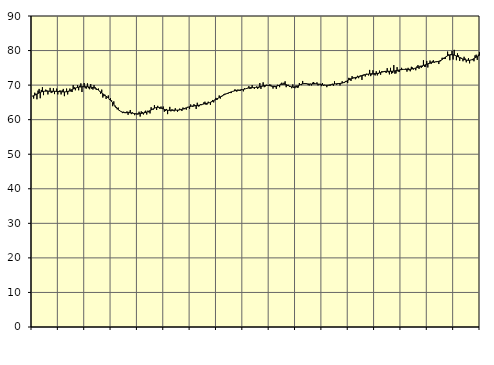
| Category | Piggar | Series 1 |
|---|---|---|
| nan | 66.9 | 66.79 |
| 87.0 | 66.1 | 66.92 |
| 87.0 | 67.8 | 67.08 |
| 87.0 | 67.5 | 67.26 |
| 87.0 | 65.9 | 67.42 |
| 87.0 | 68.4 | 67.59 |
| 87.0 | 68.9 | 67.75 |
| 87.0 | 66.2 | 67.9 |
| 87.0 | 68.6 | 68.03 |
| 87.0 | 69.4 | 68.12 |
| 87.0 | 67.1 | 68.19 |
| 87.0 | 68.2 | 68.23 |
| nan | 68.7 | 68.25 |
| 88.0 | 68.5 | 68.26 |
| 88.0 | 67.3 | 68.25 |
| 88.0 | 68.3 | 68.24 |
| 88.0 | 69.2 | 68.24 |
| 88.0 | 67.7 | 68.23 |
| 88.0 | 67.9 | 68.22 |
| 88.0 | 69.1 | 68.22 |
| 88.0 | 67.4 | 68.21 |
| 88.0 | 68.3 | 68.2 |
| 88.0 | 69 | 68.18 |
| 88.0 | 67.3 | 68.16 |
| nan | 68.3 | 68.13 |
| 89.0 | 68.5 | 68.11 |
| 89.0 | 67.3 | 68.08 |
| 89.0 | 68.5 | 68.05 |
| 89.0 | 68.9 | 68.03 |
| 89.0 | 66.8 | 68.03 |
| 89.0 | 68.1 | 68.05 |
| 89.0 | 69 | 68.1 |
| 89.0 | 67.3 | 68.17 |
| 89.0 | 68.1 | 68.28 |
| 89.0 | 69 | 68.41 |
| 89.0 | 68.1 | 68.56 |
| nan | 68 | 68.71 |
| 90.0 | 70 | 68.87 |
| 90.0 | 69.4 | 69.01 |
| 90.0 | 68.5 | 69.14 |
| 90.0 | 69.2 | 69.24 |
| 90.0 | 70 | 69.33 |
| 90.0 | 68.5 | 69.4 |
| 90.0 | 69.8 | 69.45 |
| 90.0 | 70.5 | 69.48 |
| 90.0 | 68 | 69.51 |
| 90.0 | 69.7 | 69.53 |
| 90.0 | 70.6 | 69.54 |
| nan | 69.1 | 69.54 |
| 91.0 | 69 | 69.54 |
| 91.0 | 70.5 | 69.52 |
| 91.0 | 69.1 | 69.49 |
| 91.0 | 68.8 | 69.47 |
| 91.0 | 70.3 | 69.42 |
| 91.0 | 68.9 | 69.37 |
| 91.0 | 68.7 | 69.3 |
| 91.0 | 70 | 69.21 |
| 91.0 | 69.4 | 69.1 |
| 91.0 | 68.6 | 68.95 |
| 91.0 | 68.7 | 68.77 |
| nan | 69 | 68.54 |
| 92.0 | 68.2 | 68.29 |
| 92.0 | 67.5 | 68.03 |
| 92.0 | 68.7 | 67.76 |
| 92.0 | 66.4 | 67.5 |
| 92.0 | 66.8 | 67.25 |
| 92.0 | 67.2 | 67.01 |
| 92.0 | 66 | 66.77 |
| 92.0 | 66.6 | 66.52 |
| 92.0 | 67 | 66.25 |
| 92.0 | 65.7 | 65.95 |
| 92.0 | 66.2 | 65.62 |
| nan | 65.6 | 65.27 |
| 93.0 | 63.9 | 64.88 |
| 93.0 | 65.3 | 64.48 |
| 93.0 | 63.8 | 64.07 |
| 93.0 | 63.4 | 63.67 |
| 93.0 | 63 | 63.3 |
| 93.0 | 63.5 | 62.97 |
| 93.0 | 62.5 | 62.69 |
| 93.0 | 62.5 | 62.46 |
| 93.0 | 62.2 | 62.29 |
| 93.0 | 61.9 | 62.16 |
| 93.0 | 62.3 | 62.09 |
| nan | 61.9 | 62.05 |
| 94.0 | 61.9 | 62.04 |
| 94.0 | 62.4 | 62.04 |
| 94.0 | 61.4 | 62.04 |
| 94.0 | 62.3 | 62.03 |
| 94.0 | 62.8 | 62 |
| 94.0 | 61.6 | 61.96 |
| 94.0 | 62.1 | 61.89 |
| 94.0 | 61.9 | 61.82 |
| 94.0 | 61.3 | 61.76 |
| 94.0 | 61.8 | 61.71 |
| 94.0 | 61.5 | 61.69 |
| nan | 61.5 | 61.69 |
| 95.0 | 62.3 | 61.71 |
| 95.0 | 60.9 | 61.76 |
| 95.0 | 62.4 | 61.81 |
| 95.0 | 62.2 | 61.87 |
| 95.0 | 61.5 | 61.93 |
| 95.0 | 62.3 | 62 |
| 95.0 | 62.6 | 62.08 |
| 95.0 | 61.5 | 62.17 |
| 95.0 | 62.6 | 62.3 |
| 95.0 | 62.1 | 62.45 |
| 95.0 | 61.8 | 62.62 |
| nan | 63.6 | 62.8 |
| 96.0 | 63.1 | 62.98 |
| 96.0 | 62.9 | 63.16 |
| 96.0 | 64.2 | 63.32 |
| 96.0 | 63.5 | 63.45 |
| 96.0 | 62.8 | 63.54 |
| 96.0 | 64 | 63.57 |
| 96.0 | 63.5 | 63.54 |
| 96.0 | 63.1 | 63.46 |
| 96.0 | 63.8 | 63.36 |
| 96.0 | 63.4 | 63.23 |
| 96.0 | 63.8 | 63.1 |
| nan | 62.3 | 62.98 |
| 97.0 | 62.5 | 62.87 |
| 97.0 | 63.1 | 62.79 |
| 97.0 | 61.6 | 62.74 |
| 97.0 | 62.8 | 62.71 |
| 97.0 | 63.7 | 62.7 |
| 97.0 | 62.4 | 62.71 |
| 97.0 | 63 | 62.72 |
| 97.0 | 62.6 | 62.74 |
| 97.0 | 62.4 | 62.75 |
| 97.0 | 63.3 | 62.76 |
| 97.0 | 62.7 | 62.76 |
| nan | 62.3 | 62.77 |
| 98.0 | 62.7 | 62.8 |
| 98.0 | 63.2 | 62.84 |
| 98.0 | 63 | 62.91 |
| 98.0 | 62.5 | 62.99 |
| 98.0 | 63.5 | 63.09 |
| 98.0 | 63 | 63.19 |
| 98.0 | 63.4 | 63.3 |
| 98.0 | 62.9 | 63.42 |
| 98.0 | 63.7 | 63.54 |
| 98.0 | 63.6 | 63.66 |
| 98.0 | 63.1 | 63.76 |
| nan | 64.4 | 63.84 |
| 99.0 | 64 | 63.91 |
| 99.0 | 63.7 | 63.96 |
| 99.0 | 64.5 | 63.99 |
| 99.0 | 64.2 | 64.02 |
| 99.0 | 63.1 | 64.06 |
| 99.0 | 64.9 | 64.1 |
| 99.0 | 63.8 | 64.16 |
| 99.0 | 63.9 | 64.22 |
| 99.0 | 64.5 | 64.3 |
| 99.0 | 64.2 | 64.38 |
| 99.0 | 64.4 | 64.47 |
| nan | 65 | 64.55 |
| 0.0 | 65.2 | 64.62 |
| 0.0 | 64.3 | 64.68 |
| 0.0 | 64.4 | 64.75 |
| 0.0 | 65.2 | 64.82 |
| 0.0 | 64.9 | 64.91 |
| 0.0 | 64.3 | 65.02 |
| 0.0 | 65.3 | 65.15 |
| 0.0 | 65.7 | 65.31 |
| 0.0 | 65 | 65.48 |
| 0.0 | 65.8 | 65.66 |
| 0.0 | 66.3 | 65.85 |
| nan | 65.7 | 66.04 |
| 1.0 | 66.2 | 66.22 |
| 1.0 | 67 | 66.41 |
| 1.0 | 66.1 | 66.6 |
| 1.0 | 66.6 | 66.78 |
| 1.0 | 66.8 | 66.95 |
| 1.0 | 67.3 | 67.11 |
| 1.0 | 67.5 | 67.26 |
| 1.0 | 67.5 | 67.41 |
| 1.0 | 67.6 | 67.55 |
| 1.0 | 67.5 | 67.68 |
| 1.0 | 67.9 | 67.81 |
| nan | 67.7 | 67.93 |
| 2.0 | 67.7 | 68.05 |
| 2.0 | 68.2 | 68.16 |
| 2.0 | 68.3 | 68.25 |
| 2.0 | 68.7 | 68.34 |
| 2.0 | 68.7 | 68.41 |
| 2.0 | 68.1 | 68.46 |
| 2.0 | 68.7 | 68.5 |
| 2.0 | 68.4 | 68.54 |
| 2.0 | 68.3 | 68.57 |
| 2.0 | 68.8 | 68.61 |
| 2.0 | 68.7 | 68.67 |
| nan | 68.2 | 68.74 |
| 3.0 | 69.1 | 68.83 |
| 3.0 | 68.9 | 68.93 |
| 3.0 | 68.9 | 69.03 |
| 3.0 | 69.2 | 69.11 |
| 3.0 | 69.7 | 69.18 |
| 3.0 | 68.9 | 69.23 |
| 3.0 | 69 | 69.26 |
| 3.0 | 70 | 69.28 |
| 3.0 | 69.3 | 69.29 |
| 3.0 | 68.9 | 69.3 |
| 3.0 | 69.3 | 69.32 |
| nan | 69.6 | 69.35 |
| 4.0 | 68.9 | 69.4 |
| 4.0 | 69.2 | 69.46 |
| 4.0 | 70.6 | 69.53 |
| 4.0 | 68.9 | 69.61 |
| 4.0 | 69.6 | 69.7 |
| 4.0 | 70.8 | 69.78 |
| 4.0 | 69.4 | 69.85 |
| 4.0 | 69.6 | 69.9 |
| 4.0 | 70.1 | 69.92 |
| 4.0 | 70 | 69.92 |
| 4.0 | 69.8 | 69.88 |
| nan | 70.2 | 69.83 |
| 5.0 | 70.1 | 69.76 |
| 5.0 | 69.6 | 69.7 |
| 5.0 | 69 | 69.64 |
| 5.0 | 69.8 | 69.61 |
| 5.0 | 69.4 | 69.62 |
| 5.0 | 68.9 | 69.67 |
| 5.0 | 70.1 | 69.77 |
| 5.0 | 70 | 69.89 |
| 5.0 | 69.4 | 70.03 |
| 5.0 | 70.4 | 70.16 |
| 5.0 | 70.7 | 70.25 |
| nan | 70.1 | 70.3 |
| 6.0 | 70.7 | 70.29 |
| 6.0 | 71.1 | 70.23 |
| 6.0 | 69.4 | 70.13 |
| 6.0 | 69.8 | 70.01 |
| 6.0 | 70.1 | 69.86 |
| 6.0 | 69.5 | 69.72 |
| 6.0 | 69.5 | 69.59 |
| 6.0 | 69.1 | 69.49 |
| 6.0 | 70.2 | 69.44 |
| 6.0 | 69.2 | 69.44 |
| 6.0 | 69.1 | 69.48 |
| nan | 69.9 | 69.57 |
| 7.0 | 69.2 | 69.7 |
| 7.0 | 69.3 | 69.84 |
| 7.0 | 70.6 | 70 |
| 7.0 | 70.2 | 70.15 |
| 7.0 | 70 | 70.27 |
| 7.0 | 71.2 | 70.36 |
| 7.0 | 70.3 | 70.42 |
| 7.0 | 70.6 | 70.43 |
| 7.0 | 70.6 | 70.41 |
| 7.0 | 70.4 | 70.38 |
| 7.0 | 70 | 70.34 |
| nan | 69.9 | 70.31 |
| 8.0 | 70.4 | 70.29 |
| 8.0 | 69.9 | 70.29 |
| 8.0 | 70.7 | 70.31 |
| 8.0 | 70.9 | 70.32 |
| 8.0 | 70.6 | 70.34 |
| 8.0 | 70.4 | 70.35 |
| 8.0 | 70.8 | 70.33 |
| 8.0 | 69.9 | 70.3 |
| 8.0 | 70.2 | 70.26 |
| 8.0 | 70.4 | 70.2 |
| 8.0 | 69.7 | 70.14 |
| nan | 70.6 | 70.08 |
| 9.0 | 69.8 | 70.03 |
| 9.0 | 70.1 | 69.99 |
| 9.0 | 70 | 69.97 |
| 9.0 | 69.4 | 69.97 |
| 9.0 | 69.9 | 69.99 |
| 9.0 | 69.9 | 70.03 |
| 9.0 | 69.8 | 70.08 |
| 9.0 | 70.2 | 70.14 |
| 9.0 | 70.4 | 70.2 |
| 9.0 | 69.8 | 70.26 |
| 9.0 | 71.1 | 70.32 |
| nan | 70.4 | 70.36 |
| 10.0 | 70.1 | 70.4 |
| 10.0 | 70.6 | 70.42 |
| 10.0 | 70.5 | 70.45 |
| 10.0 | 69.9 | 70.48 |
| 10.0 | 70.6 | 70.53 |
| 10.0 | 71.1 | 70.59 |
| 10.0 | 70.6 | 70.69 |
| 10.0 | 70.6 | 70.82 |
| 10.0 | 71.2 | 70.97 |
| 10.0 | 71 | 71.14 |
| 10.0 | 70.6 | 71.32 |
| nan | 72.1 | 71.49 |
| 11.0 | 72 | 71.65 |
| 11.0 | 71.2 | 71.79 |
| 11.0 | 72.6 | 71.92 |
| 11.0 | 72.2 | 72.03 |
| 11.0 | 72.2 | 72.12 |
| 11.0 | 71.7 | 72.21 |
| 11.0 | 72 | 72.28 |
| 11.0 | 72.7 | 72.35 |
| 11.0 | 72 | 72.43 |
| 11.0 | 72.7 | 72.52 |
| 11.0 | 72.8 | 72.62 |
| nan | 71.5 | 72.72 |
| 12.0 | 73 | 72.82 |
| 12.0 | 73.1 | 72.92 |
| 12.0 | 72.5 | 73.01 |
| 12.0 | 73.3 | 73.09 |
| 12.0 | 73.1 | 73.16 |
| 12.0 | 72.8 | 73.21 |
| 12.0 | 74.4 | 73.26 |
| 12.0 | 72.6 | 73.28 |
| 12.0 | 73 | 73.3 |
| 12.0 | 74.3 | 73.3 |
| 12.0 | 73 | 73.31 |
| nan | 72.8 | 73.32 |
| 13.0 | 74 | 73.35 |
| 13.0 | 72.8 | 73.39 |
| 13.0 | 73.2 | 73.46 |
| 13.0 | 74.2 | 73.54 |
| 13.0 | 73 | 73.64 |
| 13.0 | 74 | 73.73 |
| 13.0 | 74 | 73.82 |
| 13.0 | 74 | 73.89 |
| 13.0 | 74.1 | 73.95 |
| 13.0 | 73.5 | 73.98 |
| 13.0 | 74.9 | 74 |
| nan | 73.7 | 74.01 |
| 14.0 | 73.1 | 74.01 |
| 14.0 | 75 | 74.01 |
| 14.0 | 73.3 | 74.02 |
| 14.0 | 73.5 | 74.03 |
| 14.0 | 75.8 | 74.06 |
| 14.0 | 73.3 | 74.11 |
| 14.0 | 73.4 | 74.17 |
| 14.0 | 75.2 | 74.24 |
| 14.0 | 73.9 | 74.31 |
| 14.0 | 73.8 | 74.38 |
| 14.0 | 74.6 | 74.44 |
| nan | 75 | 74.48 |
| 15.0 | 74.7 | 74.52 |
| 15.0 | 74.5 | 74.54 |
| 15.0 | 74.5 | 74.55 |
| 15.0 | 74.8 | 74.55 |
| 15.0 | 73.9 | 74.55 |
| 15.0 | 75 | 74.54 |
| 15.0 | 74.3 | 74.56 |
| 15.0 | 74 | 74.59 |
| 15.0 | 75.3 | 74.63 |
| 15.0 | 75.1 | 74.7 |
| 15.0 | 74.5 | 74.77 |
| nan | 74.9 | 74.86 |
| 16.0 | 74.3 | 74.96 |
| 16.0 | 75.4 | 75.06 |
| 16.0 | 75.8 | 75.17 |
| 16.0 | 74.7 | 75.28 |
| 16.0 | 75.6 | 75.38 |
| 16.0 | 75 | 75.49 |
| 16.0 | 75.3 | 75.59 |
| 16.0 | 77.2 | 75.7 |
| 16.0 | 75.3 | 75.8 |
| 16.0 | 75.3 | 75.91 |
| 16.0 | 77 | 76.03 |
| nan | 75.1 | 76.16 |
| 17.0 | 76.1 | 76.29 |
| 17.0 | 77.1 | 76.41 |
| 17.0 | 76.1 | 76.5 |
| 17.0 | 76.9 | 76.58 |
| 17.0 | 77.2 | 76.64 |
| 17.0 | 76.5 | 76.69 |
| 17.0 | 76.8 | 76.72 |
| 17.0 | 76.9 | 76.76 |
| 17.0 | 76.7 | 76.81 |
| 17.0 | 76.1 | 76.9 |
| 17.0 | 76.8 | 77.02 |
| nan | 77.1 | 77.2 |
| 18.0 | 77.9 | 77.4 |
| 18.0 | 77.9 | 77.63 |
| 18.0 | 77.6 | 77.87 |
| 18.0 | 77.6 | 78.1 |
| 18.0 | 78.2 | 78.31 |
| 18.0 | 79.7 | 78.49 |
| 18.0 | 78.9 | 78.63 |
| 18.0 | 77.2 | 78.73 |
| 18.0 | 79 | 78.78 |
| 18.0 | 79.9 | 78.8 |
| 18.0 | 77.4 | 78.77 |
| nan | 80.2 | 78.69 |
| 19.0 | 78.5 | 78.58 |
| 19.0 | 77.2 | 78.44 |
| 19.0 | 79.2 | 78.28 |
| 19.0 | 78.6 | 78.12 |
| 19.0 | 77 | 77.96 |
| 19.0 | 78 | 77.8 |
| 19.0 | 77.6 | 77.66 |
| 19.0 | 76.9 | 77.53 |
| 19.0 | 78.2 | 77.42 |
| 19.0 | 77.7 | 77.32 |
| 19.0 | 76.6 | 77.24 |
| nan | 77.3 | 77.19 |
| 20.0 | 77.8 | 77.16 |
| 20.0 | 76.3 | 77.18 |
| 20.0 | 77.3 | 77.24 |
| 20.0 | 77.4 | 77.35 |
| 20.0 | 77.2 | 77.49 |
| 20.0 | 76.9 | 77.67 |
| 20.0 | 78.6 | 77.87 |
| 20.0 | 78.8 | 78.08 |
| 20.0 | 77.3 | 78.27 |
| 20.0 | 78.8 | 78.43 |
| 20.0 | 79.5 | 78.57 |